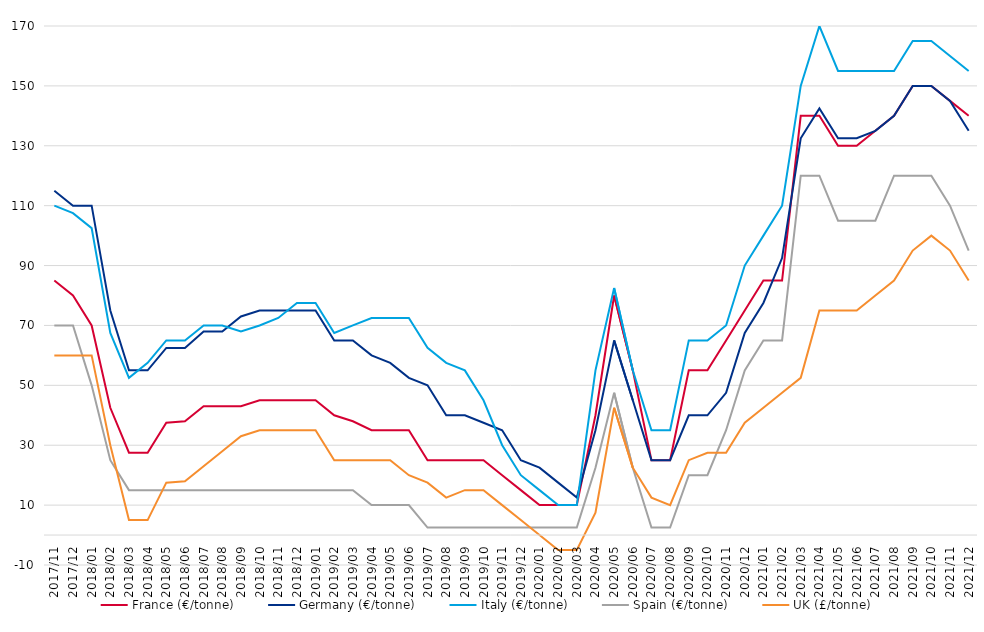
| Category | France (€/tonne) | Germany (€/tonne) | Italy (€/tonne) | Spain (€/tonne) | UK (£/tonne) |
|---|---|---|---|---|---|
| 2017/11 | 85 | 115 | 110 | 70 | 60 |
| 2017/12 | 80 | 110 | 107.5 | 70 | 60 |
| 2018/01 | 70 | 110 | 102.5 | 50 | 60 |
| 2018/02 | 42.5 | 75 | 67.5 | 25 | 30 |
| 2018/03 | 27.5 | 55 | 52.5 | 15 | 5 |
| 2018/04 | 27.5 | 55 | 57.5 | 15 | 5 |
| 2018/05 | 37.5 | 62.5 | 65 | 15 | 17.5 |
| 2018/06 | 38 | 62.5 | 65 | 15 | 18 |
| 2018/07 | 43 | 68 | 70 | 15 | 23 |
| 2018/08 | 43 | 68 | 70 | 15 | 28 |
| 2018/09 | 43 | 73 | 68 | 15 | 33 |
| 2018/10 | 45 | 75 | 70 | 15 | 35 |
| 2018/11 | 45 | 75 | 72.5 | 15 | 35 |
| 2018/12 | 45 | 75 | 77.5 | 15 | 35 |
| 2019/01 | 45 | 75 | 77.5 | 15 | 35 |
| 2019/02 | 40 | 65 | 67.5 | 15 | 25 |
| 2019/03 | 38 | 65 | 70 | 15 | 25 |
| 2019/04 | 35 | 60 | 72.5 | 10 | 25 |
| 2019/05 | 35 | 57.5 | 72.5 | 10 | 25 |
| 2019/06 | 35 | 52.5 | 72.5 | 10 | 20 |
| 2019/07 | 25 | 50 | 62.5 | 2.5 | 17.5 |
| 2019/08 | 25 | 40 | 57.5 | 2.5 | 12.5 |
| 2019/09 | 25 | 40 | 55 | 2.5 | 15 |
| 2019/10 | 25 | 37.5 | 45 | 2.5 | 15 |
| 2019/11 | 20 | 35 | 30 | 2.5 | 10 |
| 2019/12 | 15 | 25 | 20 | 2.5 | 5 |
| 2020/01 | 10 | 22.5 | 15 | 2.5 | 0 |
| 2020/02 | 10 | 17.5 | 10 | 2.5 | -5 |
| 2020/03 | 10 | 12.5 | 10 | 2.5 | -5 |
| 2020/04 | 40 | 35 | 55 | 22.5 | 7.5 |
| 2020/05 | 80 | 65 | 82.5 | 47.5 | 42.5 |
| 2020/06 | 55 | 45 | 55 | 22.5 | 22.5 |
| 2020/07 | 25 | 25 | 35 | 2.5 | 12.5 |
| 2020/08 | 25 | 25 | 35 | 2.5 | 10 |
| 2020/09 | 55 | 40 | 65 | 20 | 25 |
| 2020/10 | 55 | 40 | 65 | 20 | 27.5 |
| 2020/11 | 65 | 47.5 | 70 | 35 | 27.5 |
| 2020/12 | 75 | 67.5 | 90 | 55 | 37.5 |
| 2021/01 | 85 | 77.5 | 100 | 65 | 42.5 |
| 2021/02 | 85 | 92.5 | 110 | 65 | 47.5 |
| 2021/03 | 140 | 132.5 | 150 | 120 | 52.5 |
| 2021/04 | 140 | 142.5 | 170 | 120 | 75 |
| 2021/05 | 130 | 132.5 | 155 | 105 | 75 |
| 2021/06 | 130 | 132.5 | 155 | 105 | 75 |
| 2021/07 | 135 | 135 | 155 | 105 | 80 |
| 2021/08 | 140 | 140 | 155 | 120 | 85 |
| 2021/09 | 150 | 150 | 165 | 120 | 95 |
| 2021/10 | 150 | 150 | 165 | 120 | 100 |
| 2021/11 | 145 | 145 | 160 | 110 | 95 |
| 2021/12 | 140 | 135 | 155 | 95 | 85 |